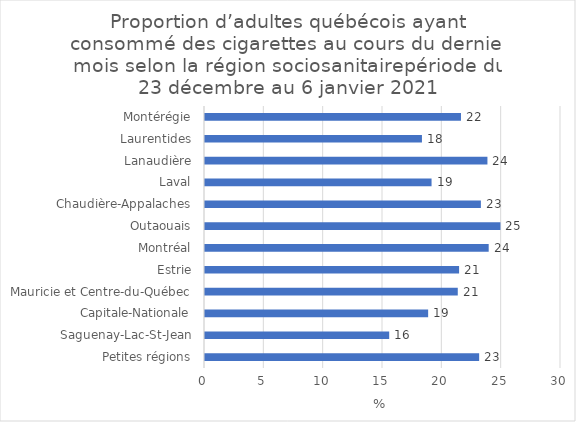
| Category | Series 0 |
|---|---|
| Petites régions | 23.103 |
| Saguenay-Lac-St-Jean | 15.523 |
| Capitale-Nationale | 18.804 |
| Mauricie et Centre-du-Québec | 21.301 |
| Estrie | 21.412 |
| Montréal | 23.906 |
| Outaouais | 24.896 |
| Chaudière-Appalaches | 23.249 |
| Laval | 19.092 |
| Lanaudière | 23.8 |
| Laurentides | 18.282 |
| Montérégie | 21.571 |